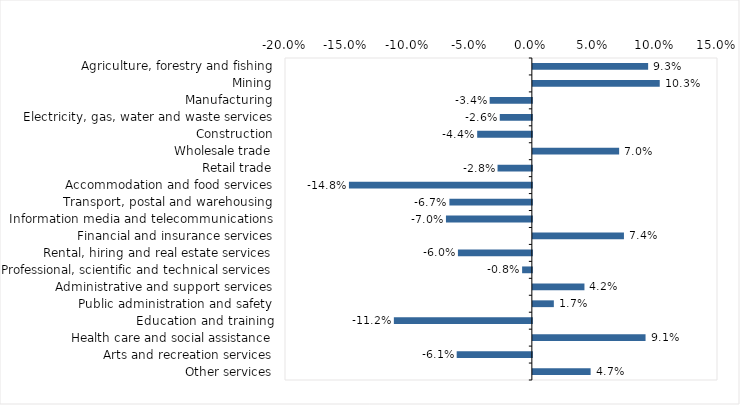
| Category | This week |
|---|---|
| Agriculture, forestry and fishing | 0.093 |
| Mining | 0.103 |
| Manufacturing | -0.034 |
| Electricity, gas, water and waste services | -0.026 |
| Construction | -0.044 |
| Wholesale trade | 0.07 |
| Retail trade | -0.028 |
| Accommodation and food services | -0.148 |
| Transport, postal and warehousing | -0.067 |
| Information media and telecommunications | -0.07 |
| Financial and insurance services | 0.074 |
| Rental, hiring and real estate services | -0.06 |
| Professional, scientific and technical services | -0.008 |
| Administrative and support services | 0.042 |
| Public administration and safety | 0.017 |
| Education and training | -0.112 |
| Health care and social assistance | 0.091 |
| Arts and recreation services | -0.061 |
| Other services | 0.047 |